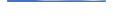
| Category | Series 0 |
|---|---|
| 0 | 10 |
| 1 | 10 |
| 2 | 12 |
| 3 | 4 |
| 4 | 6 |
| 5 | 8 |
| 6 | 8 |
| 7 | 3 |
| 8 | 8 |